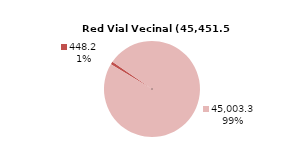
| Category | RV Vecinal |
|---|---|
| Pavimentada | 448.182 |
| No Pavimentada | 45003.332 |